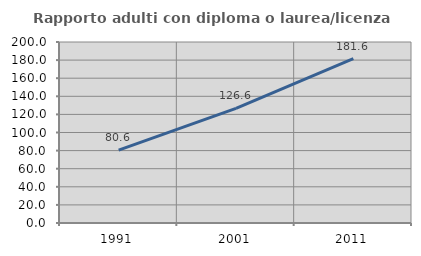
| Category | Rapporto adulti con diploma o laurea/licenza media  |
|---|---|
| 1991.0 | 80.594 |
| 2001.0 | 126.611 |
| 2011.0 | 181.573 |